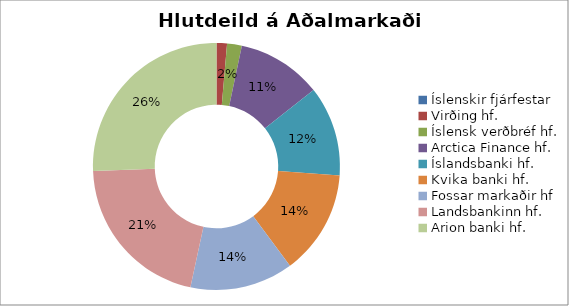
| Category | 2017 |
|---|---|
| Íslenskir fjárfestar | 0 |
| Virðing hf. | 0.014 |
| Íslensk verðbréf hf. | 0.019 |
| Arctica Finance hf. | 0.111 |
| Íslandsbanki hf. | 0.118 |
| Kvika banki hf. | 0.137 |
| Fossar markaðir hf | 0.135 |
| Landsbankinn hf. | 0.21 |
| Arion banki hf. | 0.256 |